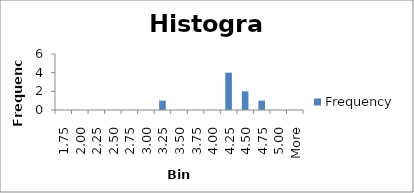
| Category | Frequency |
|---|---|
| 1.75 | 0 |
| 2.00 | 0 |
| 2.25 | 0 |
| 2.50 | 0 |
| 2.75 | 0 |
| 3.00 | 0 |
| 3.25 | 1 |
| 3.50 | 0 |
| 3.75 | 0 |
| 4.00 | 0 |
| 4.25 | 4 |
| 4.50 | 2 |
| 4.75 | 1 |
| 5.00 | 0 |
| More | 0 |